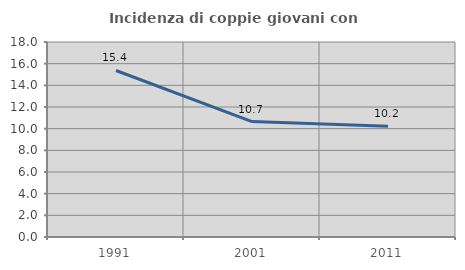
| Category | Incidenza di coppie giovani con figli |
|---|---|
| 1991.0 | 15.369 |
| 2001.0 | 10.659 |
| 2011.0 | 10.226 |